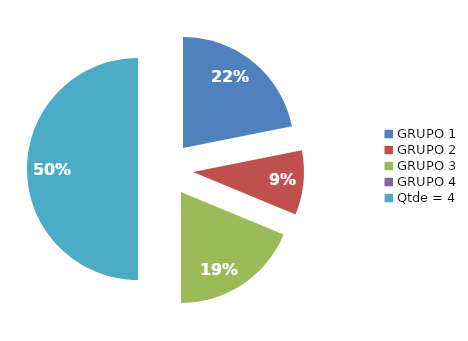
| Category | VENDAS |
|---|---|
| GRUPO 1 | 28 |
| GRUPO 2 | 12 |
| GRUPO 3 | 24 |
| GRUPO 4 | 0 |